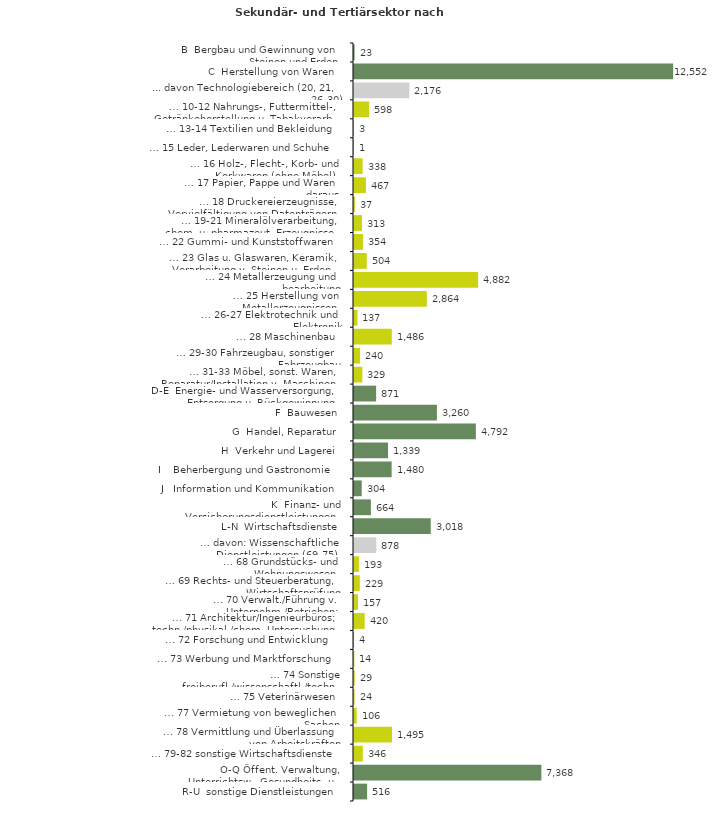
| Category | Series 0 |
|---|---|
| B  Bergbau und Gewinnung von Steinen und Erden | 23 |
| C  Herstellung von Waren | 12552 |
| ... davon Technologiebereich (20, 21, 26-30) | 2176 |
| … 10-12 Nahrungs-, Futtermittel-, Getränkeherstellung u. Tabakverarb. | 598 |
| … 13-14 Textilien und Bekleidung | 3 |
| … 15 Leder, Lederwaren und Schuhe | 1 |
| … 16 Holz-, Flecht-, Korb- und Korkwaren (ohne Möbel)  | 338 |
| … 17 Papier, Pappe und Waren daraus  | 467 |
| … 18 Druckereierzeugnisse, Vervielfältigung von Datenträgern | 37 |
| … 19-21 Mineralölverarbeitung, chem. u. pharmazeut. Erzeugnisse | 313 |
| … 22 Gummi- und Kunststoffwaren | 354 |
| … 23 Glas u. Glaswaren, Keramik, Verarbeitung v. Steinen u. Erden  | 504 |
| … 24 Metallerzeugung und -bearbeitung | 4882 |
| … 25 Herstellung von Metallerzeugnissen  | 2864 |
| … 26-27 Elektrotechnik und Elektronik | 137 |
| … 28 Maschinenbau | 1486 |
| … 29-30 Fahrzeugbau, sonstiger Fahrzeugbau | 240 |
| … 31-33 Möbel, sonst. Waren, Reparatur/Installation v. Maschinen | 329 |
| D-E  Energie- und Wasserversorgung, Entsorgung u. Rückgewinnung | 871 |
| F  Bauwesen | 3260 |
| G  Handel, Reparatur | 4792 |
| H  Verkehr und Lagerei | 1339 |
| I    Beherbergung und Gastronomie | 1480 |
| J   Information und Kommunikation | 304 |
| K  Finanz- und Versicherungsdienstleistungen | 664 |
| L-N  Wirtschaftsdienste | 3018 |
| … davon: Wissenschaftliche Dienstleistungen (69-75) | 878 |
| … 68 Grundstücks- und Wohnungswesen  | 193 |
| … 69 Rechts- und Steuerberatung, Wirtschaftsprüfung | 229 |
| … 70 Verwalt./Führung v. Unternehm./Betrieben; Unternehmensberat. | 157 |
| … 71 Architektur/Ingenieurbüros; techn./physikal./chem. Untersuchung | 420 |
| … 72 Forschung und Entwicklung  | 4 |
| … 73 Werbung und Marktforschung | 14 |
| … 74 Sonstige freiberufl./wissenschaftl./techn. Tätigkeiten | 29 |
| … 75 Veterinärwesen | 24 |
| … 77 Vermietung von beweglichen Sachen  | 106 |
| … 78 Vermittlung und Überlassung von Arbeitskräften | 1495 |
| … 79-82 sonstige Wirtschaftsdienste | 346 |
| O-Q Öffent. Verwaltung, Unterrichtsw., Gesundheits- u. Sozialwesen | 7368 |
| R-U  sonstige Dienstleistungen | 516 |